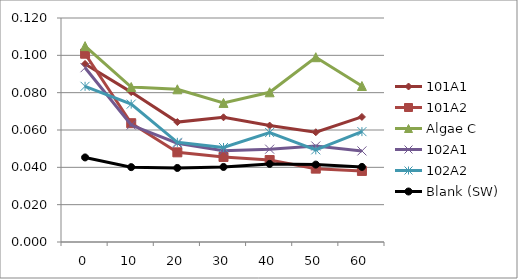
| Category | 101A1 | 101A2 | Algae C | 102A1 | 102A2 | Blank (SW) |
|---|---|---|---|---|---|---|
| 0.0 | 0.095 | 0.101 | 0.105 | 0.093 | 0.083 | 0.045 |
| 10.0 | 0.08 | 0.064 | 0.083 | 0.063 | 0.074 | 0.04 |
| 20.0 | 0.064 | 0.048 | 0.082 | 0.053 | 0.053 | 0.04 |
| 30.0 | 0.067 | 0.046 | 0.075 | 0.049 | 0.051 | 0.04 |
| 40.0 | 0.062 | 0.044 | 0.08 | 0.05 | 0.059 | 0.042 |
| 50.0 | 0.059 | 0.039 | 0.099 | 0.051 | 0.049 | 0.041 |
| 60.0 | 0.067 | 0.038 | 0.084 | 0.049 | 0.059 | 0.04 |